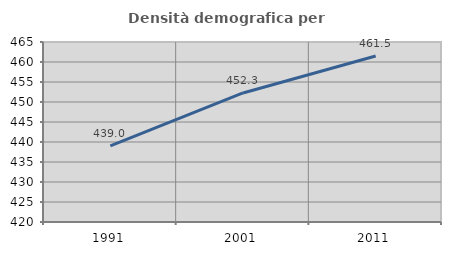
| Category | Densità demografica |
|---|---|
| 1991.0 | 439.028 |
| 2001.0 | 452.262 |
| 2011.0 | 461.514 |